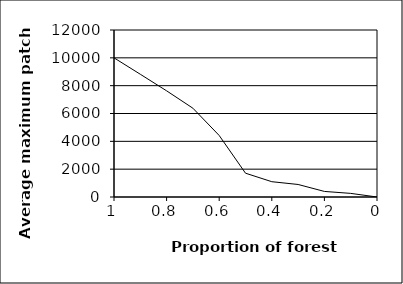
| Category | Series 0 |
|---|---|
| 1.0 | 10000 |
| 0.9 | 8820 |
| 0.8 | 7630 |
| 0.7000000000000001 | 6380 |
| 0.6000000000000001 | 4420 |
| 0.5000000000000001 | 1710 |
| 0.40000000000000013 | 1100 |
| 0.30000000000000016 | 900 |
| 0.20000000000000015 | 400 |
| 0.10000000000000014 | 260 |
| 0.0 | 0 |